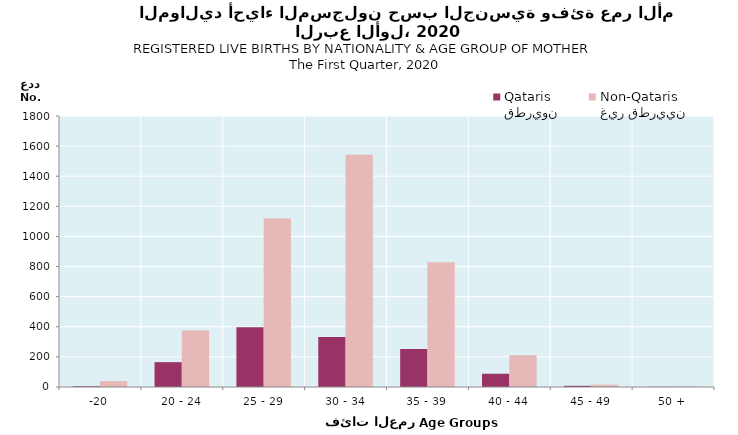
| Category | قطريون
Qataris | غير قطريين
Non-Qataris |
|---|---|---|
| -20 | 5 | 39 |
| 20 - 24 | 165 | 376 |
| 25 - 29 | 397 | 1119 |
| 30 - 34 | 332 | 1542 |
| 35 - 39 | 252 | 829 |
| 40 - 44 | 88 | 211 |
| 45 - 49 | 8 | 16 |
| 50 + | 1 | 3 |